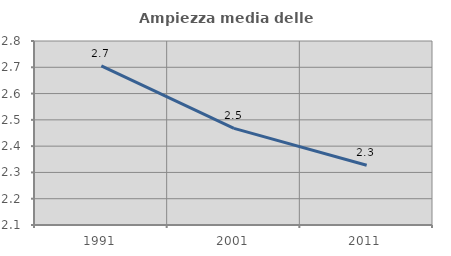
| Category | Ampiezza media delle famiglie |
|---|---|
| 1991.0 | 2.705 |
| 2001.0 | 2.467 |
| 2011.0 | 2.327 |